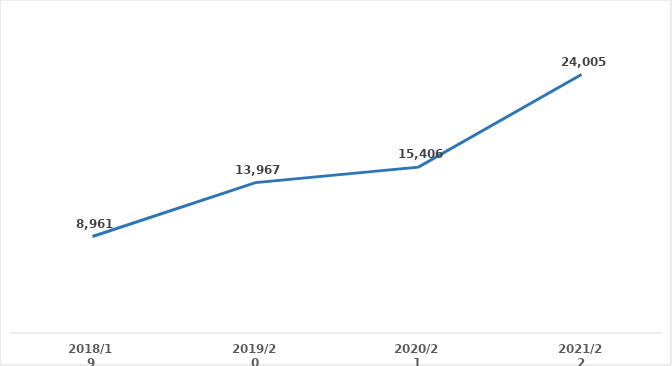
| Category | Series 0 |
|---|---|
| 2018/19 | 8961 |
| 2019/20 | 13967 |
| 2020/21 | 15406 |
| 2021/22 | 24005 |